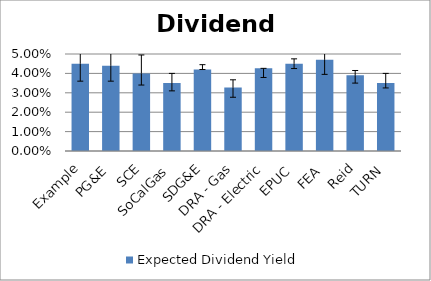
| Category | Expected Dividend Yield |
|---|---|
| Example | 0.045 |
| PG&E | 0.044 |
| SCE | 0.04 |
| SoCalGas | 0.035 |
| SDG&E | 0.042 |
| DRA - Gas | 0.033 |
| DRA - Electric | 0.043 |
| EPUC | 0.045 |
| FEA | 0.047 |
| Reid | 0.039 |
| TURN | 0.035 |